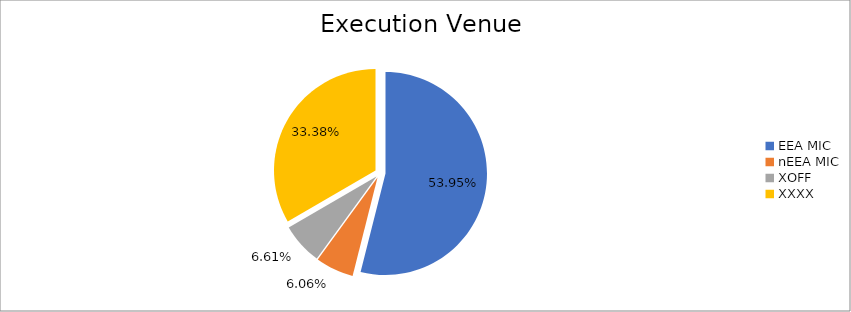
| Category | Series 0 |
|---|---|
| EEA MIC | 6263747.246 |
| nEEA MIC | 703783.93 |
| XOFF | 767459.217 |
| XXXX | 3875846.415 |